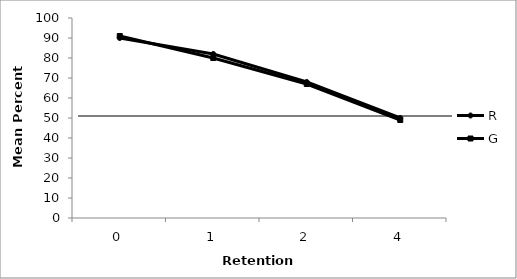
| Category | R | G |
|---|---|---|
| 0.0 | 90 | 91 |
| 1.0 | 82 | 80 |
| 2.0 | 68 | 67 |
| 4.0 | 50 | 49 |